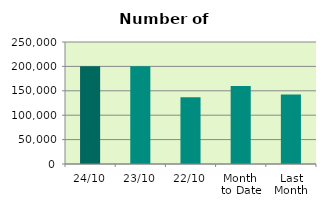
| Category | Series 0 |
|---|---|
| 24/10 | 200348 |
| 23/10 | 200248 |
| 22/10 | 136888 |
| Month 
to Date | 159831.444 |
| Last
Month | 142606.2 |